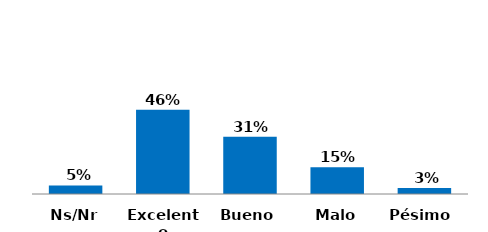
| Category | Series 0 |
|---|---|
| Pésimo  | 0.033 |
| Malo | 0.147 |
| Bueno | 0.313 |
| Excelente | 0.46 |
| Ns/Nr | 0.047 |